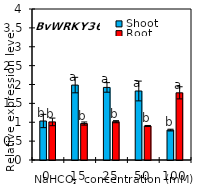
| Category | Shoot | Root |
|---|---|---|
| 0.0 | 1.033 | 1.01 |
| 15.0 | 1.985 | 0.966 |
| 25.0 | 1.923 | 1.015 |
| 50.0 | 1.828 | 0.901 |
| 100.0 | 0.793 | 1.779 |